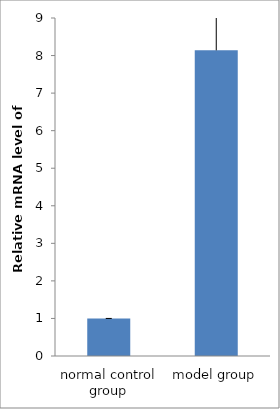
| Category | Series 0 |
|---|---|
| normal control group | 1 |
| model group | 8.138 |